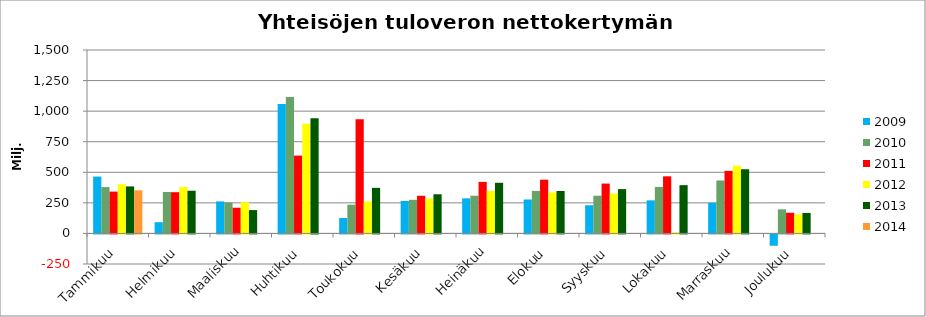
| Category | 2009 | 2010 | 2011 | 2012 | 2013 | 2014 |
|---|---|---|---|---|---|---|
| Tammikuu | 464.899 | 378.86 | 341.987 | 401.627 | 384.485 | 352.772 |
| Helmikuu | 92.021 | 339.045 | 337.078 | 379.401 | 349.199 | 0 |
| Maaliskuu | 261.783 | 253.057 | 210.203 | 256.28 | 190.945 | 0 |
| Huhtikuu | 1059.201 | 1115.624 | 636.437 | 897.203 | 940.935 | 0 |
| Toukokuu | 126.163 | 234.756 | 933.434 | 262.244 | 372.901 | 0 |
| Kesäkuu | 265.105 | 274.88 | 307.856 | 285.13 | 320.319 | 0 |
| Heinäkuu | 286.978 | 308.391 | 421.522 | 347.389 | 414.27 | 0 |
| Elokuu | 277.363 | 347.548 | 439.399 | 335.795 | 347.137 | 0 |
| Syyskuu | 230.468 | 308.333 | 407.65 | 326.578 | 362.569 | 0 |
| Lokakuu | 270.56 | 380.508 | 466.894 | 9.04 | 394.905 | 0 |
| Marraskuu | 249.968 | 432.891 | 511.438 | 554.296 | 524.993 | 0 |
| Joulukuu | -92.536 | 196.924 | 169.141 | 155.44 | 167.693 | 0 |